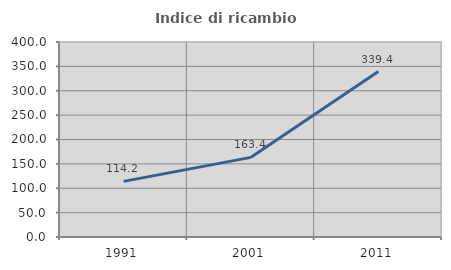
| Category | Indice di ricambio occupazionale  |
|---|---|
| 1991.0 | 114.151 |
| 2001.0 | 163.359 |
| 2011.0 | 339.444 |